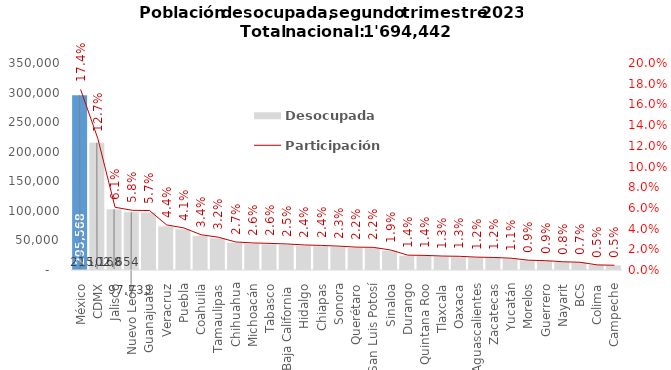
| Category | Desocupada |
|---|---|
| México | 295568 |
| CDMX | 215168 |
| Jalisco | 102654 |
| Nuevo León | 97733 |
| Guanajuato | 97308 |
| Veracruz | 73816 |
| Puebla | 68840 |
| Coahuila | 57690 |
| Tamaulipas | 53643 |
| Chihuahua | 45911 |
| Michoacán | 44305 |
| Tabasco | 43557 |
| Baja California | 42604 |
| Hidalgo | 40984 |
| Chiapas | 40204 |
| Sonora | 39071 |
| Querétaro | 37460 |
| San Luis Potosí | 37086 |
| Sinaloa | 32778 |
| Durango | 24344 |
| Quintana Roo | 23894 |
| Tlaxcala | 22846 |
| Oaxaca | 22421 |
| Aguascalientes | 21064 |
| Zacatecas | 20529 |
| Yucatán | 19324 |
| Morelos | 16056 |
| Guerrero | 15296 |
| Nayarit | 13518 |
| BCS | 12664 |
| Colima | 8354 |
| Campeche | 7752 |